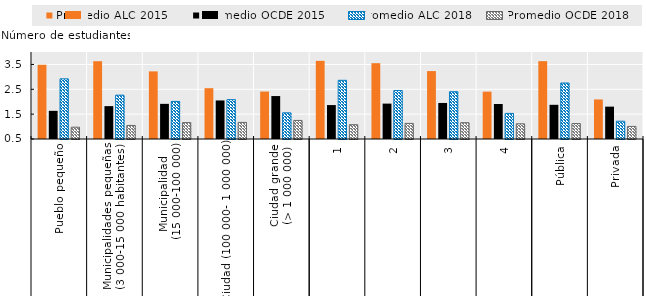
| Category | Promedio ALC 2015 | Promedio OCDE 2015 | Promedio ALC 2018 | Promedio OCDE 2018 |
|---|---|---|---|---|
| 0 | 3.487 | 1.632 | 2.92 | 0.974 |
| 1 | 3.629 | 1.823 | 2.263 | 1.045 |
| 2 | 3.221 | 1.914 | 2.012 | 1.16 |
| 3 | 2.544 | 2.051 | 2.083 | 1.169 |
| 4 | 2.409 | 2.228 | 1.554 | 1.247 |
| 5 | 3.644 | 1.865 | 2.861 | 1.076 |
| 6 | 3.55 | 1.924 | 2.452 | 1.127 |
| 7 | 3.232 | 1.95 | 2.402 | 1.155 |
| 8 | 2.405 | 1.909 | 1.53 | 1.111 |
| 9 | 3.631 | 1.875 | 2.753 | 1.12 |
| 10 | 2.091 | 1.802 | 1.215 | 1.005 |